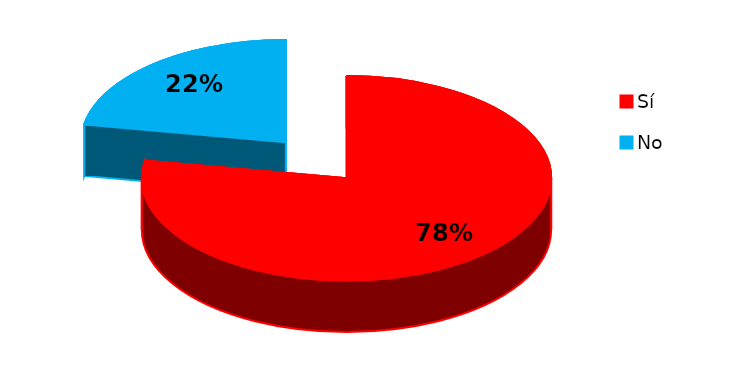
| Category | Series 0 |
|---|---|
| 0 | 14 |
| 1 | 4 |